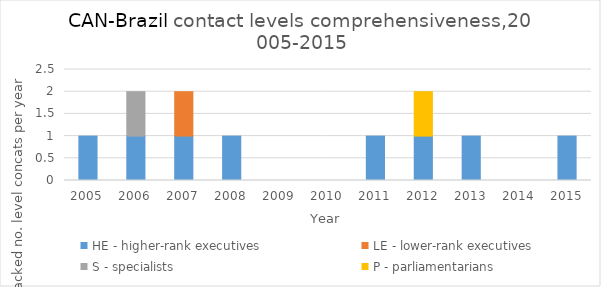
| Category | HE - higher-rank executives | LE - lower-rank executives | S - specialists | P - parliamentarians |
|---|---|---|---|---|
| 2005.0 | 1 | 0 | 0 | 0 |
| 2006.0 | 1 | 0 | 1 | 0 |
| 2007.0 | 1 | 1 | 0 | 0 |
| 2008.0 | 1 | 0 | 0 | 0 |
| 2009.0 | 0 | 0 | 0 | 0 |
| 2010.0 | 0 | 0 | 0 | 0 |
| 2011.0 | 1 | 0 | 0 | 0 |
| 2012.0 | 1 | 0 | 0 | 1 |
| 2013.0 | 1 | 0 | 0 | 0 |
| 2014.0 | 0 | 0 | 0 | 0 |
| 2015.0 | 1 | 0 | 0 | 0 |